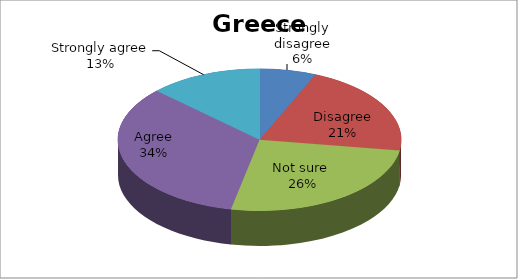
| Category | Series 0 |
|---|---|
| Strongly disagree | 4 |
| Disagree | 13 |
| Not sure  | 16 |
| Agree | 21 |
| Strongly agree | 8 |